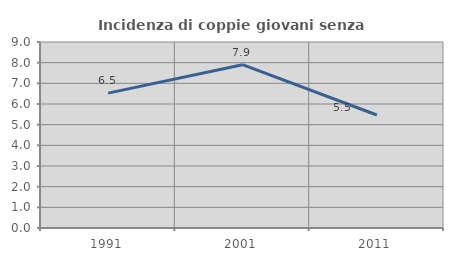
| Category | Incidenza di coppie giovani senza figli |
|---|---|
| 1991.0 | 6.525 |
| 2001.0 | 7.901 |
| 2011.0 | 5.469 |